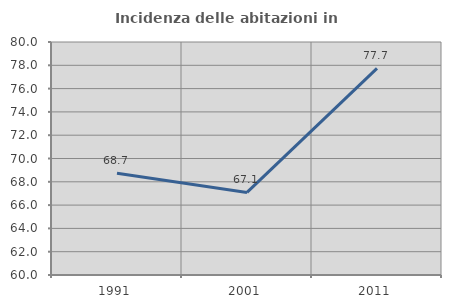
| Category | Incidenza delle abitazioni in proprietà  |
|---|---|
| 1991.0 | 68.74 |
| 2001.0 | 67.09 |
| 2011.0 | 77.741 |